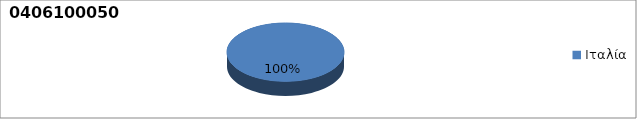
| Category | Series 0 |
|---|---|
| Ιταλία | 1 |